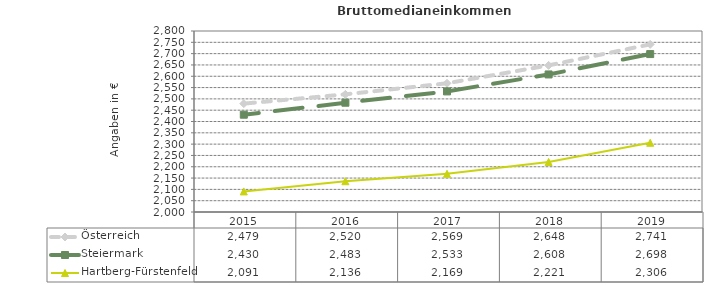
| Category | Österreich | Steiermark | Hartberg-Fürstenfeld |
|---|---|---|---|
| 2019.0 | 2741 | 2698 | 2306 |
| 2018.0 | 2648 | 2608 | 2221 |
| 2017.0 | 2569 | 2533 | 2169 |
| 2016.0 | 2520 | 2483 | 2136 |
| 2015.0 | 2479 | 2430 | 2091 |